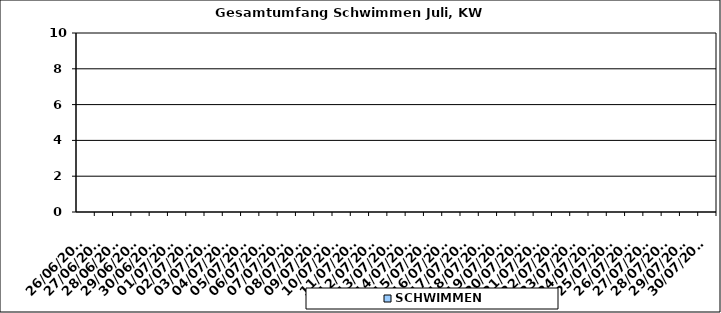
| Category | SCHWIMMEN |
|---|---|
| 26/06/2023 | 0 |
| 27/06/2023 | 0 |
| 28/06/2023 | 0 |
| 29/06/2023 | 0 |
| 30/06/2023 | 0 |
| 01/07/2023 | 0 |
| 02/07/2023 | 0 |
| 03/07/2023 | 0 |
| 04/07/2023 | 0 |
| 05/07/2023 | 0 |
| 06/07/2023 | 0 |
| 07/07/2023 | 0 |
| 08/07/2023 | 0 |
| 09/07/2023 | 0 |
| 10/07/2023 | 0 |
| 11/07/2023 | 0 |
| 12/07/2023 | 0 |
| 13/07/2023 | 0 |
| 14/07/2023 | 0 |
| 15/07/2023 | 0 |
| 16/07/2023 | 0 |
| 17/07/2023 | 0 |
| 18/07/2023 | 0 |
| 19/07/2023 | 0 |
| 20/07/2023 | 0 |
| 21/07/2023 | 0 |
| 22/07/2023 | 0 |
| 23/07/2023 | 0 |
| 24/07/2023 | 0 |
| 25/07/2023 | 0 |
| 26/07/2023 | 0 |
| 27/07/2023 | 0 |
| 28/07/2023 | 0 |
| 29/07/2023 | 0 |
| 30/07/2023 | 0 |